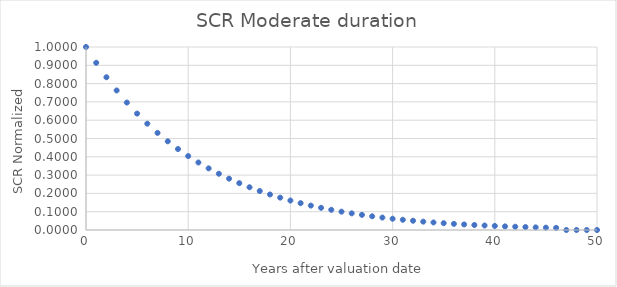
| Category |  SCR Norm  |
|---|---|
| 0.0 | 1 |
| 1.0 | 0.914 |
| 2.0 | 0.835 |
| 3.0 | 0.763 |
| 4.0 | 0.697 |
| 5.0 | 0.636 |
| 6.0 | 0.581 |
| 7.0 | 0.531 |
| 8.0 | 0.485 |
| 9.0 | 0.442 |
| 10.0 | 0.404 |
| 11.0 | 0.369 |
| 12.0 | 0.337 |
| 13.0 | 0.307 |
| 14.0 | 0.281 |
| 15.0 | 0.256 |
| 16.0 | 0.234 |
| 17.0 | 0.213 |
| 18.0 | 0.194 |
| 19.0 | 0.177 |
| 20.0 | 0.161 |
| 21.0 | 0.147 |
| 22.0 | 0.133 |
| 23.0 | 0.121 |
| 24.0 | 0.11 |
| 25.0 | 0.1 |
| 26.0 | 0.091 |
| 27.0 | 0.083 |
| 28.0 | 0.075 |
| 29.0 | 0.068 |
| 30.0 | 0.062 |
| 31.0 | 0.056 |
| 32.0 | 0.051 |
| 33.0 | 0.046 |
| 34.0 | 0.041 |
| 35.0 | 0.037 |
| 36.0 | 0.034 |
| 37.0 | 0.03 |
| 38.0 | 0.027 |
| 39.0 | 0.025 |
| 40.0 | 0.022 |
| 41.0 | 0.02 |
| 42.0 | 0.018 |
| 43.0 | 0.016 |
| 44.0 | 0.014 |
| 45.0 | 0.013 |
| 46.0 | 0.012 |
| 47.0 | 0 |
| 48.0 | 0 |
| 49.0 | 0 |
| 50.0 | 0 |
| 51.0 | 0 |
| 52.0 | 0 |
| 53.0 | 0 |
| 54.0 | 0 |
| 55.0 | 0 |
| 56.0 | 0 |
| 57.0 | 0 |
| 58.0 | 0 |
| 59.0 | 0 |
| 60.0 | 0 |
| 61.0 | 0 |
| 62.0 | 0 |
| 63.0 | 0 |
| 64.0 | 0 |
| 65.0 | 0 |
| 66.0 | 0 |
| 67.0 | 0 |
| 68.0 | 0 |
| 69.0 | 0 |
| 70.0 | 0 |
| 71.0 | 0 |
| 72.0 | 0 |
| 73.0 | 0 |
| 74.0 | 0 |
| 75.0 | 0 |
| 76.0 | 0 |
| 77.0 | 0 |
| 78.0 | 0 |
| 79.0 | 0 |
| 80.0 | 0 |